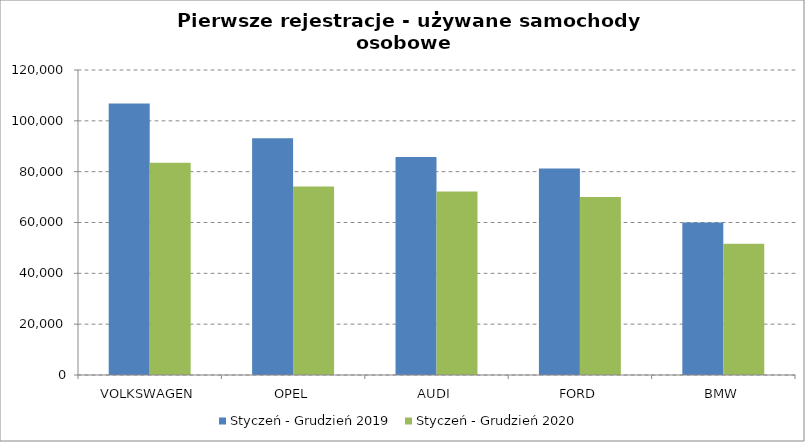
| Category | Styczeń - Grudzień 2019 | Styczeń - Grudzień 2020 |
|---|---|---|
| VOLKSWAGEN | 106822 | 83505 |
| OPEL | 93158 | 74148 |
| AUDI | 85811 | 72169 |
| FORD | 81269 | 70010 |
| BMW | 60032 | 51654 |